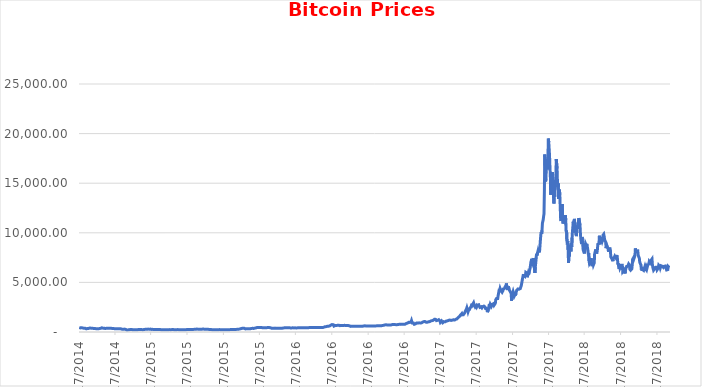
| Category | Series 0 |
|---|---|
| 9/17/14 | 457.334 |
| 9/18/14 | 424.44 |
| 9/19/14 | 394.796 |
| 9/20/14 | 408.904 |
| 9/21/14 | 398.821 |
| 9/22/14 | 402.152 |
| 9/23/14 | 435.791 |
| 9/24/14 | 423.205 |
| 9/25/14 | 411.574 |
| 9/26/14 | 404.425 |
| 9/27/14 | 399.52 |
| 9/28/14 | 377.181 |
| 9/29/14 | 375.467 |
| 9/30/14 | 386.944 |
| 10/1/14 | 383.615 |
| 10/2/14 | 375.072 |
| 10/3/14 | 359.512 |
| 10/4/14 | 328.866 |
| 10/5/14 | 320.51 |
| 10/6/14 | 330.079 |
| 10/7/14 | 336.187 |
| 10/8/14 | 352.94 |
| 10/9/14 | 365.026 |
| 10/10/14 | 361.562 |
| 10/11/14 | 362.299 |
| 10/12/14 | 378.549 |
| 10/13/14 | 390.414 |
| 10/14/14 | 400.87 |
| 10/15/14 | 394.773 |
| 10/16/14 | 382.556 |
| 10/17/14 | 383.758 |
| 10/18/14 | 391.442 |
| 10/19/14 | 389.546 |
| 10/20/14 | 382.845 |
| 10/21/14 | 386.475 |
| 10/22/14 | 383.158 |
| 10/23/14 | 358.417 |
| 10/24/14 | 358.345 |
| 10/25/14 | 347.271 |
| 10/26/14 | 354.704 |
| 10/27/14 | 352.989 |
| 10/28/14 | 357.618 |
| 10/29/14 | 335.591 |
| 10/30/14 | 345.305 |
| 10/31/14 | 338.321 |
| 11/1/14 | 325.749 |
| 11/2/14 | 325.892 |
| 11/3/14 | 327.554 |
| 11/4/14 | 330.492 |
| 11/5/14 | 339.486 |
| 11/6/14 | 349.29 |
| 11/7/14 | 342.415 |
| 11/8/14 | 345.488 |
| 11/9/14 | 363.264 |
| 11/10/14 | 366.924 |
| 11/11/14 | 367.695 |
| 11/12/14 | 423.561 |
| 11/13/14 | 420.735 |
| 11/14/14 | 397.818 |
| 11/15/14 | 376.133 |
| 11/16/14 | 387.882 |
| 11/17/14 | 387.408 |
| 11/18/14 | 375.198 |
| 11/19/14 | 380.555 |
| 11/20/14 | 357.84 |
| 11/21/14 | 350.848 |
| 11/22/14 | 352.92 |
| 11/23/14 | 367.573 |
| 11/24/14 | 376.901 |
| 11/25/14 | 375.348 |
| 11/26/14 | 368.37 |
| 11/27/14 | 369.67 |
| 11/28/14 | 376.447 |
| 11/29/14 | 375.491 |
| 11/30/14 | 378.047 |
| 12/1/14 | 379.245 |
| 12/2/14 | 381.315 |
| 12/3/14 | 375.01 |
| 12/4/14 | 369.604 |
| 12/5/14 | 376.854 |
| 12/6/14 | 374.785 |
| 12/7/14 | 375.095 |
| 12/8/14 | 361.909 |
| 12/9/14 | 352.219 |
| 12/10/14 | 346.365 |
| 12/11/14 | 350.506 |
| 12/12/14 | 352.542 |
| 12/13/14 | 347.376 |
| 12/14/14 | 351.632 |
| 12/15/14 | 345.345 |
| 12/16/14 | 327.062 |
| 12/17/14 | 319.776 |
| 12/18/14 | 311.396 |
| 12/19/14 | 317.843 |
| 12/20/14 | 329.956 |
| 12/21/14 | 320.843 |
| 12/22/14 | 331.886 |
| 12/23/14 | 334.572 |
| 12/24/14 | 322.534 |
| 12/25/14 | 319.008 |
| 12/26/14 | 327.924 |
| 12/27/14 | 315.863 |
| 12/28/14 | 317.239 |
| 12/29/14 | 312.67 |
| 12/30/14 | 310.737 |
| 12/31/14 | 320.193 |
| 1/1/15 | 314.249 |
| 1/2/15 | 315.032 |
| 1/3/15 | 281.082 |
| 1/4/15 | 264.195 |
| 1/5/15 | 274.474 |
| 1/6/15 | 286.189 |
| 1/7/15 | 294.337 |
| 1/8/15 | 283.349 |
| 1/9/15 | 290.408 |
| 1/10/15 | 274.796 |
| 1/11/15 | 265.66 |
| 1/12/15 | 267.796 |
| 1/13/15 | 225.861 |
| 1/14/15 | 178.103 |
| 1/15/15 | 209.844 |
| 1/16/15 | 208.097 |
| 1/17/15 | 199.26 |
| 1/18/15 | 210.339 |
| 1/19/15 | 214.861 |
| 1/20/15 | 211.315 |
| 1/21/15 | 226.897 |
| 1/22/15 | 233.406 |
| 1/23/15 | 232.879 |
| 1/24/15 | 247.847 |
| 1/25/15 | 253.718 |
| 1/26/15 | 273.473 |
| 1/27/15 | 263.475 |
| 1/28/15 | 233.915 |
| 1/29/15 | 233.513 |
| 1/30/15 | 226.425 |
| 1/31/15 | 217.464 |
| 2/1/15 | 226.972 |
| 2/2/15 | 238.229 |
| 2/3/15 | 227.268 |
| 2/4/15 | 226.853 |
| 2/5/15 | 217.111 |
| 2/6/15 | 222.266 |
| 2/7/15 | 227.754 |
| 2/8/15 | 223.412 |
| 2/9/15 | 220.11 |
| 2/10/15 | 219.839 |
| 2/11/15 | 219.185 |
| 2/12/15 | 221.764 |
| 2/13/15 | 235.427 |
| 2/14/15 | 257.321 |
| 2/15/15 | 234.825 |
| 2/16/15 | 233.843 |
| 2/17/15 | 243.61 |
| 2/18/15 | 236.326 |
| 2/19/15 | 240.283 |
| 2/20/15 | 243.779 |
| 2/21/15 | 244.534 |
| 2/22/15 | 235.977 |
| 2/23/15 | 238.892 |
| 2/24/15 | 238.735 |
| 2/25/15 | 237.47 |
| 2/26/15 | 236.426 |
| 2/27/15 | 253.828 |
| 2/28/15 | 254.263 |
| 3/1/15 | 260.202 |
| 3/2/15 | 275.67 |
| 3/3/15 | 281.702 |
| 3/4/15 | 273.092 |
| 3/5/15 | 276.178 |
| 3/6/15 | 272.723 |
| 3/7/15 | 276.261 |
| 3/8/15 | 274.354 |
| 3/9/15 | 289.607 |
| 3/10/15 | 291.76 |
| 3/11/15 | 296.379 |
| 3/12/15 | 294.354 |
| 3/13/15 | 285.337 |
| 3/14/15 | 281.885 |
| 3/15/15 | 286.393 |
| 3/16/15 | 290.593 |
| 3/17/15 | 285.505 |
| 3/18/15 | 256.299 |
| 3/19/15 | 260.928 |
| 3/20/15 | 261.749 |
| 3/21/15 | 260.025 |
| 3/22/15 | 267.96 |
| 3/23/15 | 266.74 |
| 3/24/15 | 245.595 |
| 3/25/15 | 246.197 |
| 3/26/15 | 248.532 |
| 3/27/15 | 247.029 |
| 3/28/15 | 252.798 |
| 3/29/15 | 242.713 |
| 3/30/15 | 247.526 |
| 3/31/15 | 244.224 |
| 4/1/15 | 247.272 |
| 4/2/15 | 253.005 |
| 4/3/15 | 254.322 |
| 4/4/15 | 253.697 |
| 4/5/15 | 260.598 |
| 4/6/15 | 255.492 |
| 4/7/15 | 253.18 |
| 4/8/15 | 245.022 |
| 4/9/15 | 243.676 |
| 4/10/15 | 236.072 |
| 4/11/15 | 236.552 |
| 4/12/15 | 236.153 |
| 4/13/15 | 224.587 |
| 4/14/15 | 219.159 |
| 4/15/15 | 223.833 |
| 4/16/15 | 228.573 |
| 4/17/15 | 222.882 |
| 4/18/15 | 223.356 |
| 4/19/15 | 222.6 |
| 4/20/15 | 224.626 |
| 4/21/15 | 235.269 |
| 4/22/15 | 234.176 |
| 4/23/15 | 236.462 |
| 4/24/15 | 231.268 |
| 4/25/15 | 226.39 |
| 4/26/15 | 219.43 |
| 4/27/15 | 229.286 |
| 4/28/15 | 225.855 |
| 4/29/15 | 225.808 |
| 4/30/15 | 236.145 |
| 5/1/15 | 232.079 |
| 5/2/15 | 234.93 |
| 5/3/15 | 240.358 |
| 5/4/15 | 239.018 |
| 5/5/15 | 236.121 |
| 5/6/15 | 229.782 |
| 5/7/15 | 237.334 |
| 5/8/15 | 243.863 |
| 5/9/15 | 241.832 |
| 5/10/15 | 240.296 |
| 5/11/15 | 242.158 |
| 5/12/15 | 241.112 |
| 5/13/15 | 236.377 |
| 5/14/15 | 236.929 |
| 5/15/15 | 237.605 |
| 5/16/15 | 236.153 |
| 5/17/15 | 236.802 |
| 5/18/15 | 233.128 |
| 5/19/15 | 231.947 |
| 5/20/15 | 234.018 |
| 5/21/15 | 235.344 |
| 5/22/15 | 240.348 |
| 5/23/15 | 238.872 |
| 5/24/15 | 240.953 |
| 5/25/15 | 237.11 |
| 5/26/15 | 237.116 |
| 5/27/15 | 237.283 |
| 5/28/15 | 237.408 |
| 5/29/15 | 237.096 |
| 5/30/15 | 233.345 |
| 5/31/15 | 230.19 |
| 6/1/15 | 222.926 |
| 6/2/15 | 225.803 |
| 6/3/15 | 225.874 |
| 6/4/15 | 224.324 |
| 6/5/15 | 224.952 |
| 6/6/15 | 225.619 |
| 6/7/15 | 222.881 |
| 6/8/15 | 228.489 |
| 6/9/15 | 229.048 |
| 6/10/15 | 228.803 |
| 6/11/15 | 229.705 |
| 6/12/15 | 229.982 |
| 6/13/15 | 232.402 |
| 6/14/15 | 233.543 |
| 6/15/15 | 236.823 |
| 6/16/15 | 250.895 |
| 6/17/15 | 249.284 |
| 6/18/15 | 249.007 |
| 6/19/15 | 244.606 |
| 6/20/15 | 245.212 |
| 6/21/15 | 243.944 |
| 6/22/15 | 246.99 |
| 6/23/15 | 244.296 |
| 6/24/15 | 240.515 |
| 6/25/15 | 242.799 |
| 6/26/15 | 243.594 |
| 6/27/15 | 250.99 |
| 6/28/15 | 249.011 |
| 6/29/15 | 257.064 |
| 6/30/15 | 263.072 |
| 7/1/15 | 258.621 |
| 7/2/15 | 255.412 |
| 7/3/15 | 256.336 |
| 7/4/15 | 260.886 |
| 7/5/15 | 271.913 |
| 7/6/15 | 269.03 |
| 7/7/15 | 266.207 |
| 7/8/15 | 270.785 |
| 7/9/15 | 269.228 |
| 7/10/15 | 284.894 |
| 7/11/15 | 293.115 |
| 7/12/15 | 310.867 |
| 7/13/15 | 292.054 |
| 7/14/15 | 287.464 |
| 7/15/15 | 285.829 |
| 7/16/15 | 278.089 |
| 7/17/15 | 279.472 |
| 7/18/15 | 274.901 |
| 7/19/15 | 273.614 |
| 7/20/15 | 278.981 |
| 7/21/15 | 275.833 |
| 7/22/15 | 277.222 |
| 7/23/15 | 276.049 |
| 7/24/15 | 288.278 |
| 7/25/15 | 288.697 |
| 7/26/15 | 292.686 |
| 7/27/15 | 293.624 |
| 7/28/15 | 294.427 |
| 7/29/15 | 289.59 |
| 7/30/15 | 287.722 |
| 7/31/15 | 284.65 |
| 8/1/15 | 281.601 |
| 8/2/15 | 282.614 |
| 8/3/15 | 281.227 |
| 8/4/15 | 285.218 |
| 8/5/15 | 281.882 |
| 8/6/15 | 278.577 |
| 8/7/15 | 279.585 |
| 8/8/15 | 260.997 |
| 8/9/15 | 265.083 |
| 8/10/15 | 264.47 |
| 8/11/15 | 270.386 |
| 8/12/15 | 266.376 |
| 8/13/15 | 264.08 |
| 8/14/15 | 265.68 |
| 8/15/15 | 261.551 |
| 8/16/15 | 258.507 |
| 8/17/15 | 257.976 |
| 8/18/15 | 211.079 |
| 8/19/15 | 226.684 |
| 8/20/15 | 235.35 |
| 8/21/15 | 232.569 |
| 8/22/15 | 230.39 |
| 8/23/15 | 228.169 |
| 8/24/15 | 210.495 |
| 8/25/15 | 221.609 |
| 8/26/15 | 225.831 |
| 8/27/15 | 224.769 |
| 8/28/15 | 231.396 |
| 8/29/15 | 229.78 |
| 8/30/15 | 228.761 |
| 8/31/15 | 230.056 |
| 9/1/15 | 228.121 |
| 9/2/15 | 229.284 |
| 9/3/15 | 227.183 |
| 9/4/15 | 230.298 |
| 9/5/15 | 235.019 |
| 9/6/15 | 239.84 |
| 9/7/15 | 239.847 |
| 9/8/15 | 243.607 |
| 9/9/15 | 238.168 |
| 9/10/15 | 238.477 |
| 9/11/15 | 240.107 |
| 9/12/15 | 235.229 |
| 9/13/15 | 230.512 |
| 9/14/15 | 230.644 |
| 9/15/15 | 230.304 |
| 9/16/15 | 229.091 |
| 9/17/15 | 229.81 |
| 9/18/15 | 232.975 |
| 9/19/15 | 231.493 |
| 9/20/15 | 231.212 |
| 9/21/15 | 227.085 |
| 9/22/15 | 230.618 |
| 9/23/15 | 230.283 |
| 9/24/15 | 234.529 |
| 9/25/15 | 235.144 |
| 9/26/15 | 234.34 |
| 9/27/15 | 232.757 |
| 9/28/15 | 239.142 |
| 9/29/15 | 236.687 |
| 9/30/15 | 236.06 |
| 10/1/15 | 237.549 |
| 10/2/15 | 237.293 |
| 10/3/15 | 238.73 |
| 10/4/15 | 238.259 |
| 10/5/15 | 240.383 |
| 10/6/15 | 246.063 |
| 10/7/15 | 242.969 |
| 10/8/15 | 242.304 |
| 10/9/15 | 243.931 |
| 10/10/15 | 244.941 |
| 10/11/15 | 247.05 |
| 10/12/15 | 245.308 |
| 10/13/15 | 249.508 |
| 10/14/15 | 251.989 |
| 10/15/15 | 254.32 |
| 10/16/15 | 262.869 |
| 10/17/15 | 270.64 |
| 10/18/15 | 261.643 |
| 10/19/15 | 263.437 |
| 10/20/15 | 269.463 |
| 10/21/15 | 266.272 |
| 10/22/15 | 274.023 |
| 10/23/15 | 276.496 |
| 10/24/15 | 281.654 |
| 10/25/15 | 283.68 |
| 10/26/15 | 285.3 |
| 10/27/15 | 293.788 |
| 10/28/15 | 304.618 |
| 10/29/15 | 313.855 |
| 10/30/15 | 328.015 |
| 10/31/15 | 314.166 |
| 11/1/15 | 325.431 |
| 11/2/15 | 361.189 |
| 11/3/15 | 403.417 |
| 11/4/15 | 411.563 |
| 11/5/15 | 386.354 |
| 11/6/15 | 374.47 |
| 11/7/15 | 386.482 |
| 11/8/15 | 373.368 |
| 11/9/15 | 380.257 |
| 11/10/15 | 336.819 |
| 11/11/15 | 311.084 |
| 11/12/15 | 338.152 |
| 11/13/15 | 336.753 |
| 11/14/15 | 332.906 |
| 11/15/15 | 320.166 |
| 11/16/15 | 330.751 |
| 11/17/15 | 335.094 |
| 11/18/15 | 334.59 |
| 11/19/15 | 326.149 |
| 11/20/15 | 322.022 |
| 11/21/15 | 326.927 |
| 11/22/15 | 324.536 |
| 11/23/15 | 323.046 |
| 11/24/15 | 320.046 |
| 11/25/15 | 328.206 |
| 11/26/15 | 352.684 |
| 11/27/15 | 358.042 |
| 11/28/15 | 357.381 |
| 11/29/15 | 371.294 |
| 11/30/15 | 377.321 |
| 12/1/15 | 362.488 |
| 12/2/15 | 359.187 |
| 12/3/15 | 361.046 |
| 12/4/15 | 363.183 |
| 12/5/15 | 388.949 |
| 12/6/15 | 388.783 |
| 12/7/15 | 395.536 |
| 12/8/15 | 415.563 |
| 12/9/15 | 417.563 |
| 12/10/15 | 415.479 |
| 12/11/15 | 451.938 |
| 12/12/15 | 434.997 |
| 12/13/15 | 433.755 |
| 12/14/15 | 444.182 |
| 12/15/15 | 465.321 |
| 12/16/15 | 454.934 |
| 12/17/15 | 456.078 |
| 12/18/15 | 463.616 |
| 12/19/15 | 462.322 |
| 12/20/15 | 442.685 |
| 12/21/15 | 438.639 |
| 12/22/15 | 436.572 |
| 12/23/15 | 442.401 |
| 12/24/15 | 454.985 |
| 12/25/15 | 455.653 |
| 12/26/15 | 417.274 |
| 12/27/15 | 422.823 |
| 12/28/15 | 422.279 |
| 12/29/15 | 432.983 |
| 12/30/15 | 426.62 |
| 12/31/15 | 430.567 |
| 1/1/16 | 434.334 |
| 1/2/16 | 433.438 |
| 1/3/16 | 430.011 |
| 1/4/16 | 433.091 |
| 1/5/16 | 431.96 |
| 1/6/16 | 429.105 |
| 1/7/16 | 458.048 |
| 1/8/16 | 453.23 |
| 1/9/16 | 447.611 |
| 1/10/16 | 447.991 |
| 1/11/16 | 448.428 |
| 1/12/16 | 435.69 |
| 1/13/16 | 432.371 |
| 1/14/16 | 430.306 |
| 1/15/16 | 364.331 |
| 1/16/16 | 387.536 |
| 1/17/16 | 382.299 |
| 1/18/16 | 387.168 |
| 1/19/16 | 380.149 |
| 1/20/16 | 420.23 |
| 1/21/16 | 410.262 |
| 1/22/16 | 382.492 |
| 1/23/16 | 387.491 |
| 1/24/16 | 402.971 |
| 1/25/16 | 391.726 |
| 1/26/16 | 392.153 |
| 1/27/16 | 394.972 |
| 1/28/16 | 380.289 |
| 1/29/16 | 379.474 |
| 1/30/16 | 378.255 |
| 1/31/16 | 368.767 |
| 2/1/16 | 373.056 |
| 2/2/16 | 374.448 |
| 2/3/16 | 369.949 |
| 2/4/16 | 389.594 |
| 2/5/16 | 386.549 |
| 2/6/16 | 376.522 |
| 2/7/16 | 376.62 |
| 2/8/16 | 373.447 |
| 2/9/16 | 376.029 |
| 2/10/16 | 381.649 |
| 2/11/16 | 379.654 |
| 2/12/16 | 384.263 |
| 2/13/16 | 391.86 |
| 2/14/16 | 407.23 |
| 2/15/16 | 400.185 |
| 2/16/16 | 407.488 |
| 2/17/16 | 416.322 |
| 2/18/16 | 422.373 |
| 2/19/16 | 420.785 |
| 2/20/16 | 437.164 |
| 2/21/16 | 438.798 |
| 2/22/16 | 437.748 |
| 2/23/16 | 420.736 |
| 2/24/16 | 424.955 |
| 2/25/16 | 424.544 |
| 2/26/16 | 432.152 |
| 2/27/16 | 432.519 |
| 2/28/16 | 433.504 |
| 2/29/16 | 437.697 |
| 3/1/16 | 435.123 |
| 3/2/16 | 423.989 |
| 3/3/16 | 421.651 |
| 3/4/16 | 410.939 |
| 3/5/16 | 400.57 |
| 3/6/16 | 407.707 |
| 3/7/16 | 414.321 |
| 3/8/16 | 413.972 |
| 3/9/16 | 414.86 |
| 3/10/16 | 417.131 |
| 3/11/16 | 421.69 |
| 3/12/16 | 411.624 |
| 3/13/16 | 414.065 |
| 3/14/16 | 416.438 |
| 3/15/16 | 416.83 |
| 3/16/16 | 417.011 |
| 3/17/16 | 420.621 |
| 3/18/16 | 409.548 |
| 3/19/16 | 410.444 |
| 3/20/16 | 413.755 |
| 3/21/16 | 413.307 |
| 3/22/16 | 418.089 |
| 3/23/16 | 418.041 |
| 3/24/16 | 416.394 |
| 3/25/16 | 417.177 |
| 3/26/16 | 417.945 |
| 3/27/16 | 426.765 |
| 3/28/16 | 424.231 |
| 3/29/16 | 416.516 |
| 3/30/16 | 414.816 |
| 3/31/16 | 416.729 |
| 4/1/16 | 417.96 |
| 4/2/16 | 420.873 |
| 4/3/16 | 420.904 |
| 4/4/16 | 421.444 |
| 4/5/16 | 424.03 |
| 4/6/16 | 423.413 |
| 4/7/16 | 422.745 |
| 4/8/16 | 420.349 |
| 4/9/16 | 419.411 |
| 4/10/16 | 421.564 |
| 4/11/16 | 422.483 |
| 4/12/16 | 425.19 |
| 4/13/16 | 423.734 |
| 4/14/16 | 424.282 |
| 4/15/16 | 429.713 |
| 4/16/16 | 430.572 |
| 4/17/16 | 427.399 |
| 4/18/16 | 428.591 |
| 4/19/16 | 435.509 |
| 4/20/16 | 441.389 |
| 4/21/16 | 449.425 |
| 4/22/16 | 445.737 |
| 4/23/16 | 450.282 |
| 4/24/16 | 458.555 |
| 4/25/16 | 461.426 |
| 4/26/16 | 466.089 |
| 4/27/16 | 444.687 |
| 4/28/16 | 449.011 |
| 4/29/16 | 455.097 |
| 4/30/16 | 448.318 |
| 5/1/16 | 451.875 |
| 5/2/16 | 444.669 |
| 5/3/16 | 450.304 |
| 5/4/16 | 446.722 |
| 5/5/16 | 447.976 |
| 5/6/16 | 459.603 |
| 5/7/16 | 458.536 |
| 5/8/16 | 458.548 |
| 5/9/16 | 460.483 |
| 5/10/16 | 450.895 |
| 5/11/16 | 452.728 |
| 5/12/16 | 454.766 |
| 5/13/16 | 455.67 |
| 5/14/16 | 455.671 |
| 5/15/16 | 457.568 |
| 5/16/16 | 454.163 |
| 5/17/16 | 453.783 |
| 5/18/16 | 454.619 |
| 5/19/16 | 438.715 |
| 5/20/16 | 442.676 |
| 5/21/16 | 443.188 |
| 5/22/16 | 439.323 |
| 5/23/16 | 444.155 |
| 5/24/16 | 445.981 |
| 5/25/16 | 449.599 |
| 5/26/16 | 453.384 |
| 5/27/16 | 473.464 |
| 5/28/16 | 530.04 |
| 5/29/16 | 526.233 |
| 5/30/16 | 533.864 |
| 5/31/16 | 531.386 |
| 6/1/16 | 536.92 |
| 6/2/16 | 537.972 |
| 6/3/16 | 569.194 |
| 6/4/16 | 572.727 |
| 6/5/16 | 574.977 |
| 6/6/16 | 585.537 |
| 6/7/16 | 576.597 |
| 6/8/16 | 581.645 |
| 6/9/16 | 574.63 |
| 6/10/16 | 577.47 |
| 6/11/16 | 606.727 |
| 6/12/16 | 672.784 |
| 6/13/16 | 704.376 |
| 6/14/16 | 685.559 |
| 6/15/16 | 694.469 |
| 6/16/16 | 766.308 |
| 6/17/16 | 748.909 |
| 6/18/16 | 756.227 |
| 6/19/16 | 763.781 |
| 6/20/16 | 737.226 |
| 6/21/16 | 666.652 |
| 6/22/16 | 596.116 |
| 6/23/16 | 623.977 |
| 6/24/16 | 665.299 |
| 6/25/16 | 665.123 |
| 6/26/16 | 629.367 |
| 6/27/16 | 655.275 |
| 6/28/16 | 647.001 |
| 6/29/16 | 639.89 |
| 6/30/16 | 673.337 |
| 7/1/16 | 676.296 |
| 7/2/16 | 703.702 |
| 7/3/16 | 658.664 |
| 7/4/16 | 683.662 |
| 7/5/16 | 670.627 |
| 7/6/16 | 677.331 |
| 7/7/16 | 640.562 |
| 7/8/16 | 666.523 |
| 7/9/16 | 650.96 |
| 7/10/16 | 649.36 |
| 7/11/16 | 647.659 |
| 7/12/16 | 664.551 |
| 7/13/16 | 654.468 |
| 7/14/16 | 658.078 |
| 7/15/16 | 663.255 |
| 7/16/16 | 660.767 |
| 7/17/16 | 679.459 |
| 7/18/16 | 673.106 |
| 7/19/16 | 672.864 |
| 7/20/16 | 665.685 |
| 7/21/16 | 665.012 |
| 7/22/16 | 650.619 |
| 7/23/16 | 655.556 |
| 7/24/16 | 661.285 |
| 7/25/16 | 654.097 |
| 7/26/16 | 651.784 |
| 7/27/16 | 654.352 |
| 7/28/16 | 655.035 |
| 7/29/16 | 656.992 |
| 7/30/16 | 655.047 |
| 7/31/16 | 624.681 |
| 8/1/16 | 606.272 |
| 8/2/16 | 547.465 |
| 8/3/16 | 566.355 |
| 8/4/16 | 578.289 |
| 8/5/16 | 575.043 |
| 8/6/16 | 587.778 |
| 8/7/16 | 592.69 |
| 8/8/16 | 591.054 |
| 8/9/16 | 587.801 |
| 8/10/16 | 592.103 |
| 8/11/16 | 589.12 |
| 8/12/16 | 587.559 |
| 8/13/16 | 585.588 |
| 8/14/16 | 570.473 |
| 8/15/16 | 567.24 |
| 8/16/16 | 577.439 |
| 8/17/16 | 573.216 |
| 8/18/16 | 574.318 |
| 8/19/16 | 575.63 |
| 8/20/16 | 581.697 |
| 8/21/16 | 581.308 |
| 8/22/16 | 586.753 |
| 8/23/16 | 583.415 |
| 8/24/16 | 580.182 |
| 8/25/16 | 577.761 |
| 8/26/16 | 579.651 |
| 8/27/16 | 569.947 |
| 8/28/16 | 573.912 |
| 8/29/16 | 574.107 |
| 8/30/16 | 577.503 |
| 8/31/16 | 575.472 |
| 9/1/16 | 572.303 |
| 9/2/16 | 575.537 |
| 9/3/16 | 598.212 |
| 9/4/16 | 608.634 |
| 9/5/16 | 606.59 |
| 9/6/16 | 610.436 |
| 9/7/16 | 614.544 |
| 9/8/16 | 626.316 |
| 9/9/16 | 622.861 |
| 9/10/16 | 623.509 |
| 9/11/16 | 606.719 |
| 9/12/16 | 608.243 |
| 9/13/16 | 609.241 |
| 9/14/16 | 610.684 |
| 9/15/16 | 607.155 |
| 9/16/16 | 606.973 |
| 9/17/16 | 605.984 |
| 9/18/16 | 609.874 |
| 9/19/16 | 609.227 |
| 9/20/16 | 608.312 |
| 9/21/16 | 597.149 |
| 9/22/16 | 596.298 |
| 9/23/16 | 602.842 |
| 9/24/16 | 602.625 |
| 9/25/16 | 600.826 |
| 9/26/16 | 608.043 |
| 9/27/16 | 606.166 |
| 9/28/16 | 604.728 |
| 9/29/16 | 605.693 |
| 9/30/16 | 609.735 |
| 10/1/16 | 613.983 |
| 10/2/16 | 610.892 |
| 10/3/16 | 612.133 |
| 10/4/16 | 610.204 |
| 10/5/16 | 612.511 |
| 10/6/16 | 613.021 |
| 10/7/16 | 617.121 |
| 10/8/16 | 619.108 |
| 10/9/16 | 616.752 |
| 10/10/16 | 618.994 |
| 10/11/16 | 641.072 |
| 10/12/16 | 636.192 |
| 10/13/16 | 636.786 |
| 10/14/16 | 640.378 |
| 10/15/16 | 638.646 |
| 10/16/16 | 641.631 |
| 10/17/16 | 639.193 |
| 10/18/16 | 637.96 |
| 10/19/16 | 630.52 |
| 10/20/16 | 630.857 |
| 10/21/16 | 632.828 |
| 10/22/16 | 657.294 |
| 10/23/16 | 657.071 |
| 10/24/16 | 653.761 |
| 10/25/16 | 657.588 |
| 10/26/16 | 678.304 |
| 10/27/16 | 688.313 |
| 10/28/16 | 689.651 |
| 10/29/16 | 714.479 |
| 10/30/16 | 701.864 |
| 10/31/16 | 700.972 |
| 11/1/16 | 729.793 |
| 11/2/16 | 740.829 |
| 11/3/16 | 688.7 |
| 11/4/16 | 703.235 |
| 11/5/16 | 703.418 |
| 11/6/16 | 711.522 |
| 11/7/16 | 703.131 |
| 11/8/16 | 709.848 |
| 11/9/16 | 723.273 |
| 11/10/16 | 715.534 |
| 11/11/16 | 716.411 |
| 11/12/16 | 705.054 |
| 11/13/16 | 702.031 |
| 11/14/16 | 705.021 |
| 11/15/16 | 711.619 |
| 11/16/16 | 744.198 |
| 11/17/16 | 740.977 |
| 11/18/16 | 751.585 |
| 11/19/16 | 751.616 |
| 11/20/16 | 731.026 |
| 11/21/16 | 739.248 |
| 11/22/16 | 751.347 |
| 11/23/16 | 744.594 |
| 11/24/16 | 740.289 |
| 11/25/16 | 741.649 |
| 11/26/16 | 735.382 |
| 11/27/16 | 732.035 |
| 11/28/16 | 735.813 |
| 11/29/16 | 735.604 |
| 11/30/16 | 745.691 |
| 12/1/16 | 756.774 |
| 12/2/16 | 777.944 |
| 12/3/16 | 771.155 |
| 12/4/16 | 773.872 |
| 12/5/16 | 758.7 |
| 12/6/16 | 764.224 |
| 12/7/16 | 768.132 |
| 12/8/16 | 770.81 |
| 12/9/16 | 772.794 |
| 12/10/16 | 774.65 |
| 12/11/16 | 769.731 |
| 12/12/16 | 780.087 |
| 12/13/16 | 780.556 |
| 12/14/16 | 781.481 |
| 12/15/16 | 778.088 |
| 12/16/16 | 784.907 |
| 12/17/16 | 790.829 |
| 12/18/16 | 790.53 |
| 12/19/16 | 792.714 |
| 12/20/16 | 800.876 |
| 12/21/16 | 834.281 |
| 12/22/16 | 864.54 |
| 12/23/16 | 921.984 |
| 12/24/16 | 898.822 |
| 12/25/16 | 896.183 |
| 12/26/16 | 907.61 |
| 12/27/16 | 933.198 |
| 12/28/16 | 975.921 |
| 12/29/16 | 973.497 |
| 12/30/16 | 961.238 |
| 12/31/16 | 963.743 |
| 1/1/17 | 998.325 |
| 1/2/17 | 1021.75 |
| 1/3/17 | 1043.84 |
| 1/4/17 | 1154.73 |
| 1/5/17 | 1013.38 |
| 1/6/17 | 902.201 |
| 1/7/17 | 908.585 |
| 1/8/17 | 911.199 |
| 1/9/17 | 902.828 |
| 1/10/17 | 907.679 |
| 1/11/17 | 777.757 |
| 1/12/17 | 804.834 |
| 1/13/17 | 823.984 |
| 1/14/17 | 818.412 |
| 1/15/17 | 821.798 |
| 1/16/17 | 831.534 |
| 1/17/17 | 907.938 |
| 1/18/17 | 886.618 |
| 1/19/17 | 899.073 |
| 1/20/17 | 895.026 |
| 1/21/17 | 921.789 |
| 1/22/17 | 924.673 |
| 1/23/17 | 921.012 |
| 1/24/17 | 892.687 |
| 1/25/17 | 901.542 |
| 1/26/17 | 917.586 |
| 1/27/17 | 919.75 |
| 1/28/17 | 921.59 |
| 1/29/17 | 919.496 |
| 1/30/17 | 920.382 |
| 1/31/17 | 970.403 |
| 2/1/17 | 989.023 |
| 2/2/17 | 1011.8 |
| 2/3/17 | 1029.91 |
| 2/4/17 | 1042.9 |
| 2/5/17 | 1027.34 |
| 2/6/17 | 1038.15 |
| 2/7/17 | 1061.35 |
| 2/8/17 | 1063.07 |
| 2/9/17 | 994.383 |
| 2/10/17 | 988.674 |
| 2/11/17 | 1004.45 |
| 2/12/17 | 999.181 |
| 2/13/17 | 990.642 |
| 2/14/17 | 1004.55 |
| 2/15/17 | 1007.48 |
| 2/16/17 | 1027.44 |
| 2/17/17 | 1046.21 |
| 2/18/17 | 1054.42 |
| 2/19/17 | 1047.87 |
| 2/20/17 | 1079.98 |
| 2/21/17 | 1115.3 |
| 2/22/17 | 1117.44 |
| 2/23/17 | 1166.72 |
| 2/24/17 | 1173.68 |
| 2/25/17 | 1143.84 |
| 2/26/17 | 1165.2 |
| 2/27/17 | 1179.97 |
| 2/28/17 | 1179.97 |
| 3/1/17 | 1222.5 |
| 3/2/17 | 1251.01 |
| 3/3/17 | 1274.99 |
| 3/4/17 | 1255.15 |
| 3/5/17 | 1267.12 |
| 3/6/17 | 1272.83 |
| 3/7/17 | 1223.54 |
| 3/8/17 | 1150 |
| 3/9/17 | 1188.49 |
| 3/10/17 | 1116.72 |
| 3/11/17 | 1175.83 |
| 3/12/17 | 1221.38 |
| 3/13/17 | 1231.92 |
| 3/14/17 | 1240 |
| 3/15/17 | 1249.61 |
| 3/16/17 | 1187.81 |
| 3/17/17 | 1100.23 |
| 3/18/17 | 973.818 |
| 3/19/17 | 1036.74 |
| 3/20/17 | 1054.23 |
| 3/21/17 | 1120.54 |
| 3/22/17 | 1049.14 |
| 3/23/17 | 1038.59 |
| 3/24/17 | 937.52 |
| 3/25/17 | 972.779 |
| 3/26/17 | 966.725 |
| 3/27/17 | 1045.77 |
| 3/28/17 | 1047.15 |
| 3/29/17 | 1039.97 |
| 3/30/17 | 1026.43 |
| 3/31/17 | 1071.79 |
| 4/1/17 | 1080.5 |
| 4/2/17 | 1102.17 |
| 4/3/17 | 1143.81 |
| 4/4/17 | 1133.25 |
| 4/5/17 | 1124.78 |
| 4/6/17 | 1182.68 |
| 4/7/17 | 1176.9 |
| 4/8/17 | 1175.95 |
| 4/9/17 | 1187.87 |
| 4/10/17 | 1187.13 |
| 4/11/17 | 1205.01 |
| 4/12/17 | 1200.37 |
| 4/13/17 | 1169.28 |
| 4/14/17 | 1167.54 |
| 4/15/17 | 1172.52 |
| 4/16/17 | 1182.94 |
| 4/17/17 | 1193.91 |
| 4/18/17 | 1211.67 |
| 4/19/17 | 1210.29 |
| 4/20/17 | 1229.08 |
| 4/21/17 | 1222.05 |
| 4/22/17 | 1231.71 |
| 4/23/17 | 1207.21 |
| 4/24/17 | 1250.15 |
| 4/25/17 | 1265.49 |
| 4/26/17 | 1281.08 |
| 4/27/17 | 1317.73 |
| 4/28/17 | 1316.48 |
| 4/29/17 | 1321.79 |
| 4/30/17 | 1347.89 |
| 5/1/17 | 1421.6 |
| 5/2/17 | 1452.82 |
| 5/3/17 | 1490.09 |
| 5/4/17 | 1537.67 |
| 5/5/17 | 1555.45 |
| 5/6/17 | 1578.8 |
| 5/7/17 | 1596.71 |
| 5/8/17 | 1723.35 |
| 5/9/17 | 1755.36 |
| 5/10/17 | 1787.13 |
| 5/11/17 | 1848.57 |
| 5/12/17 | 1724.24 |
| 5/13/17 | 1804.91 |
| 5/14/17 | 1808.91 |
| 5/15/17 | 1738.43 |
| 5/16/17 | 1734.45 |
| 5/17/17 | 1839.09 |
| 5/18/17 | 1888.65 |
| 5/19/17 | 1987.71 |
| 5/20/17 | 2084.73 |
| 5/21/17 | 2041.2 |
| 5/22/17 | 2173.4 |
| 5/23/17 | 2320.42 |
| 5/24/17 | 2443.64 |
| 5/25/17 | 2304.98 |
| 5/26/17 | 2202.42 |
| 5/27/17 | 2038.87 |
| 5/28/17 | 2155.8 |
| 5/29/17 | 2255.61 |
| 5/30/17 | 2175.47 |
| 5/31/17 | 2286.41 |
| 6/1/17 | 2407.88 |
| 6/2/17 | 2488.55 |
| 6/3/17 | 2515.35 |
| 6/4/17 | 2511.81 |
| 6/5/17 | 2686.81 |
| 6/6/17 | 2863.2 |
| 6/7/17 | 2732.16 |
| 6/8/17 | 2805.62 |
| 6/9/17 | 2823.81 |
| 6/10/17 | 2947.71 |
| 6/11/17 | 2958.11 |
| 6/12/17 | 2659.63 |
| 6/13/17 | 2717.02 |
| 6/14/17 | 2506.37 |
| 6/15/17 | 2464.58 |
| 6/16/17 | 2518.56 |
| 6/17/17 | 2655.88 |
| 6/18/17 | 2548.29 |
| 6/19/17 | 2589.6 |
| 6/20/17 | 2721.79 |
| 6/21/17 | 2689.1 |
| 6/22/17 | 2705.41 |
| 6/23/17 | 2744.91 |
| 6/24/17 | 2608.72 |
| 6/25/17 | 2589.41 |
| 6/26/17 | 2478.45 |
| 6/27/17 | 2552.45 |
| 6/28/17 | 2574.79 |
| 6/29/17 | 2539.32 |
| 6/30/17 | 2480.84 |
| 7/1/17 | 2434.55 |
| 7/2/17 | 2506.47 |
| 7/3/17 | 2564.06 |
| 7/4/17 | 2601.64 |
| 7/5/17 | 2601.99 |
| 7/6/17 | 2608.56 |
| 7/7/17 | 2518.66 |
| 7/8/17 | 2571.34 |
| 7/9/17 | 2518.44 |
| 7/10/17 | 2372.56 |
| 7/11/17 | 2337.79 |
| 7/12/17 | 2398.84 |
| 7/13/17 | 2357.9 |
| 7/14/17 | 2233.34 |
| 7/15/17 | 1998.86 |
| 7/16/17 | 1929.82 |
| 7/17/17 | 2228.41 |
| 7/18/17 | 2318.88 |
| 7/19/17 | 2273.43 |
| 7/20/17 | 2817.6 |
| 7/21/17 | 2667.76 |
| 7/22/17 | 2810.12 |
| 7/23/17 | 2730.4 |
| 7/24/17 | 2754.86 |
| 7/25/17 | 2576.48 |
| 7/26/17 | 2529.45 |
| 7/27/17 | 2671.78 |
| 7/28/17 | 2809.01 |
| 7/29/17 | 2726.45 |
| 7/30/17 | 2757.18 |
| 7/31/17 | 2875.34 |
| 8/1/17 | 2718.26 |
| 8/2/17 | 2710.67 |
| 8/3/17 | 2804.73 |
| 8/4/17 | 2895.89 |
| 8/5/17 | 3252.91 |
| 8/6/17 | 3213.94 |
| 8/7/17 | 3378.94 |
| 8/8/17 | 3419.94 |
| 8/9/17 | 3342.47 |
| 8/10/17 | 3381.28 |
| 8/11/17 | 3650.62 |
| 8/12/17 | 3884.71 |
| 8/13/17 | 4073.26 |
| 8/14/17 | 4325.13 |
| 8/15/17 | 4181.93 |
| 8/16/17 | 4376.63 |
| 8/17/17 | 4331.69 |
| 8/18/17 | 4160.62 |
| 8/19/17 | 4193.7 |
| 8/20/17 | 4087.66 |
| 8/21/17 | 4001.74 |
| 8/22/17 | 4100.52 |
| 8/23/17 | 4151.52 |
| 8/24/17 | 4334.68 |
| 8/25/17 | 4371.6 |
| 8/26/17 | 4352.4 |
| 8/27/17 | 4382.88 |
| 8/28/17 | 4382.66 |
| 8/29/17 | 4579.02 |
| 8/30/17 | 4565.3 |
| 8/31/17 | 4703.39 |
| 9/1/17 | 4892.01 |
| 9/2/17 | 4578.77 |
| 9/3/17 | 4582.96 |
| 9/4/17 | 4236.31 |
| 9/5/17 | 4376.53 |
| 9/6/17 | 4597.12 |
| 9/7/17 | 4599.88 |
| 9/8/17 | 4228.75 |
| 9/9/17 | 4226.06 |
| 9/10/17 | 4122.94 |
| 9/11/17 | 4161.27 |
| 9/12/17 | 4130.81 |
| 9/13/17 | 3882.59 |
| 9/14/17 | 3154.95 |
| 9/15/17 | 3637.52 |
| 9/16/17 | 3625.04 |
| 9/17/17 | 3582.88 |
| 9/18/17 | 4065.2 |
| 9/19/17 | 3924.97 |
| 9/20/17 | 3905.95 |
| 9/21/17 | 3631.04 |
| 9/22/17 | 3630.7 |
| 9/23/17 | 3792.4 |
| 9/24/17 | 3682.84 |
| 9/25/17 | 3926.07 |
| 9/26/17 | 3892.35 |
| 9/27/17 | 4200.67 |
| 9/28/17 | 4174.73 |
| 9/29/17 | 4163.07 |
| 9/30/17 | 4338.71 |
| 10/1/17 | 4403.74 |
| 10/2/17 | 4409.32 |
| 10/3/17 | 4317.48 |
| 10/4/17 | 4229.36 |
| 10/5/17 | 4328.41 |
| 10/6/17 | 4370.81 |
| 10/7/17 | 4426.89 |
| 10/8/17 | 4610.48 |
| 10/9/17 | 4772.02 |
| 10/10/17 | 4781.99 |
| 10/11/17 | 4826.48 |
| 10/12/17 | 5446.91 |
| 10/13/17 | 5647.21 |
| 10/14/17 | 5831.79 |
| 10/15/17 | 5678.19 |
| 10/16/17 | 5725.59 |
| 10/17/17 | 5605.51 |
| 10/18/17 | 5590.69 |
| 10/19/17 | 5708.52 |
| 10/20/17 | 6011.45 |
| 10/21/17 | 6031.6 |
| 10/22/17 | 6008.42 |
| 10/23/17 | 5930.32 |
| 10/24/17 | 5526.64 |
| 10/25/17 | 5750.8 |
| 10/26/17 | 5904.83 |
| 10/27/17 | 5780.9 |
| 10/28/17 | 5753.09 |
| 10/29/17 | 6153.85 |
| 10/30/17 | 6130.53 |
| 10/31/17 | 6468.4 |
| 11/1/17 | 6767.31 |
| 11/2/17 | 7078.5 |
| 11/3/17 | 7207.76 |
| 11/4/17 | 7379.95 |
| 11/5/17 | 7407.41 |
| 11/6/17 | 7022.76 |
| 11/7/17 | 7144.38 |
| 11/8/17 | 7459.69 |
| 11/9/17 | 7143.58 |
| 11/10/17 | 6618.14 |
| 11/11/17 | 6357.6 |
| 11/12/17 | 5950.07 |
| 11/13/17 | 6559.49 |
| 11/14/17 | 6635.75 |
| 11/15/17 | 7315.54 |
| 11/16/17 | 7871.69 |
| 11/17/17 | 7708.99 |
| 11/18/17 | 7790.15 |
| 11/19/17 | 8036.49 |
| 11/20/17 | 8200.64 |
| 11/21/17 | 8071.26 |
| 11/22/17 | 8253.55 |
| 11/23/17 | 8038.77 |
| 11/24/17 | 8253.69 |
| 11/25/17 | 8790.92 |
| 11/26/17 | 9330.55 |
| 11/27/17 | 9818.35 |
| 11/28/17 | 10058.8 |
| 11/29/17 | 9888.61 |
| 11/30/17 | 10233.6 |
| 12/1/17 | 10975.6 |
| 12/2/17 | 11074.6 |
| 12/3/17 | 11323.2 |
| 12/4/17 | 11657.2 |
| 12/5/17 | 11916.7 |
| 12/6/17 | 14291.5 |
| 12/7/17 | 17899.699 |
| 12/8/17 | 16569.4 |
| 12/9/17 | 15178.2 |
| 12/10/17 | 15455.4 |
| 12/11/17 | 16936.801 |
| 12/12/17 | 17415.4 |
| 12/13/17 | 16408.199 |
| 12/14/17 | 16564 |
| 12/15/17 | 17706.9 |
| 12/16/17 | 19497.4 |
| 12/17/17 | 19140.801 |
| 12/18/17 | 19114.199 |
| 12/19/17 | 17776.699 |
| 12/20/17 | 16624.6 |
| 12/21/17 | 15802.9 |
| 12/22/17 | 13831.8 |
| 12/23/17 | 14699.2 |
| 12/24/17 | 13925.8 |
| 12/25/17 | 14026.6 |
| 12/26/17 | 16099.8 |
| 12/27/17 | 15838.5 |
| 12/28/17 | 14606.5 |
| 12/29/17 | 14656.2 |
| 12/30/17 | 12952.2 |
| 12/31/17 | 14156.4 |
| 1/1/18 | 13657.2 |
| 1/2/18 | 14982.1 |
| 1/3/18 | 15201 |
| 1/4/18 | 15599.2 |
| 1/5/18 | 17429.5 |
| 1/6/18 | 17527 |
| 1/7/18 | 16477.6 |
| 1/8/18 | 15170.1 |
| 1/9/18 | 14595.4 |
| 1/10/18 | 14973.3 |
| 1/11/18 | 13405.8 |
| 1/12/18 | 13980.6 |
| 1/13/18 | 14360.2 |
| 1/14/18 | 13772 |
| 1/15/18 | 13819.8 |
| 1/16/18 | 11490.5 |
| 1/17/18 | 11188.6 |
| 1/18/18 | 11474.9 |
| 1/19/18 | 11607.4 |
| 1/20/18 | 12899.2 |
| 1/21/18 | 11600.1 |
| 1/22/18 | 10931.4 |
| 1/23/18 | 10868.4 |
| 1/24/18 | 11359.4 |
| 1/25/18 | 11259.4 |
| 1/26/18 | 11171.4 |
| 1/27/18 | 11440.7 |
| 1/28/18 | 11786.3 |
| 1/29/18 | 11296.4 |
| 1/30/18 | 10106.3 |
| 1/31/18 | 10221.1 |
| 2/1/18 | 9170.54 |
| 2/2/18 | 8830.75 |
| 2/3/18 | 9174.91 |
| 2/4/18 | 8277.01 |
| 2/5/18 | 6955.27 |
| 2/6/18 | 7754 |
| 2/7/18 | 7621.3 |
| 2/8/18 | 8265.59 |
| 2/9/18 | 8736.98 |
| 2/10/18 | 8621.9 |
| 2/11/18 | 8129.97 |
| 2/12/18 | 8926.57 |
| 2/13/18 | 8598.31 |
| 2/14/18 | 9494.63 |
| 2/15/18 | 10166.4 |
| 2/16/18 | 10233.9 |
| 2/17/18 | 11112.7 |
| 2/18/18 | 10551.8 |
| 2/19/18 | 11225.3 |
| 2/20/18 | 11403.7 |
| 2/21/18 | 10690.4 |
| 2/22/18 | 10005 |
| 2/23/18 | 10301.1 |
| 2/24/18 | 9813.07 |
| 2/25/18 | 9664.73 |
| 2/26/18 | 10366.7 |
| 2/27/18 | 10725.6 |
| 2/28/18 | 10397.9 |
| 3/1/18 | 10951 |
| 3/2/18 | 11086.4 |
| 3/3/18 | 11489.7 |
| 3/4/18 | 11512.6 |
| 3/5/18 | 11573.3 |
| 3/6/18 | 10779.9 |
| 3/7/18 | 9965.57 |
| 3/8/18 | 9395.01 |
| 3/9/18 | 9337.55 |
| 3/10/18 | 8866 |
| 3/11/18 | 9578.63 |
| 3/12/18 | 9205.12 |
| 3/13/18 | 9194.85 |
| 3/14/18 | 8269.81 |
| 3/15/18 | 8300.86 |
| 3/16/18 | 8338.35 |
| 3/17/18 | 7916.88 |
| 3/18/18 | 8223.68 |
| 3/19/18 | 8630.65 |
| 3/20/18 | 8913.47 |
| 3/21/18 | 8929.28 |
| 3/22/18 | 8728.47 |
| 3/23/18 | 8879.62 |
| 3/24/18 | 8668.12 |
| 3/25/18 | 8495.78 |
| 3/26/18 | 8209.4 |
| 3/27/18 | 7833.04 |
| 3/28/18 | 7954.48 |
| 3/29/18 | 7165.7 |
| 3/30/18 | 6890.52 |
| 3/31/18 | 6973.53 |
| 4/1/18 | 6844.23 |
| 4/2/18 | 7083.8 |
| 4/3/18 | 7456.11 |
| 4/4/18 | 6853.84 |
| 4/5/18 | 6811.47 |
| 4/6/18 | 6636.32 |
| 4/7/18 | 6911.09 |
| 4/8/18 | 7023.52 |
| 4/9/18 | 6770.73 |
| 4/10/18 | 6834.76 |
| 4/11/18 | 6968.32 |
| 4/12/18 | 7889.25 |
| 4/13/18 | 7895.96 |
| 4/14/18 | 7986.24 |
| 4/15/18 | 8329.11 |
| 4/16/18 | 8058.67 |
| 4/17/18 | 7902.09 |
| 4/18/18 | 8163.42 |
| 4/19/18 | 8294.31 |
| 4/20/18 | 8845.83 |
| 4/21/18 | 8895.58 |
| 4/22/18 | 8802.46 |
| 4/23/18 | 8930.88 |
| 4/24/18 | 9697.5 |
| 4/25/18 | 8845.74 |
| 4/26/18 | 9281.51 |
| 4/27/18 | 8987.05 |
| 4/28/18 | 9348.48 |
| 4/29/18 | 9419.08 |
| 4/30/18 | 9240.55 |
| 5/1/18 | 9119.01 |
| 5/2/18 | 9235.92 |
| 5/3/18 | 9743.86 |
| 5/4/18 | 9700.76 |
| 5/5/18 | 9858.15 |
| 5/6/18 | 9654.8 |
| 5/7/18 | 9373.01 |
| 5/8/18 | 9234.82 |
| 5/9/18 | 9325.18 |
| 5/10/18 | 9043.94 |
| 5/11/18 | 8441.49 |
| 5/12/18 | 8504.89 |
| 5/13/18 | 8723.94 |
| 5/14/18 | 8716.79 |
| 5/15/18 | 8510.38 |
| 5/16/18 | 8368.83 |
| 5/17/18 | 8094.32 |
| 5/18/18 | 8250.97 |
| 5/19/18 | 8247.18 |
| 5/20/18 | 8513.25 |
| 5/21/18 | 8418.99 |
| 5/22/18 | 8041.78 |
| 5/23/18 | 7557.82 |
| 5/24/18 | 7587.34 |
| 5/25/18 | 7480.14 |
| 5/26/18 | 7355.88 |
| 5/27/18 | 7368.22 |
| 5/28/18 | 7135.99 |
| 5/29/18 | 7472.59 |
| 5/30/18 | 7406.52 |
| 5/31/18 | 7494.17 |
| 6/1/18 | 7541.45 |
| 6/2/18 | 7643.45 |
| 6/3/18 | 7720.25 |
| 6/4/18 | 7514.47 |
| 6/5/18 | 7633.76 |
| 6/6/18 | 7653.98 |
| 6/7/18 | 7678.24 |
| 6/8/18 | 7624.92 |
| 6/9/18 | 7531.98 |
| 6/10/18 | 6786.02 |
| 6/11/18 | 6906.92 |
| 6/12/18 | 6582.36 |
| 6/13/18 | 6349.9 |
| 6/14/18 | 6675.35 |
| 6/15/18 | 6456.58 |
| 6/16/18 | 6550.16 |
| 6/17/18 | 6499.27 |
| 6/18/18 | 6734.82 |
| 6/19/18 | 6769.94 |
| 6/20/18 | 6776.55 |
| 6/21/18 | 6729.74 |
| 6/22/18 | 6083.69 |
| 6/23/18 | 6162.48 |
| 6/24/18 | 6173.23 |
| 6/25/18 | 6249.18 |
| 6/26/18 | 6093.67 |
| 6/27/18 | 6157.13 |
| 6/28/18 | 5903.44 |
| 6/29/18 | 6218.3 |
| 6/30/18 | 6404 |
| 7/1/18 | 6385.82 |
| 7/2/18 | 6614.18 |
| 7/3/18 | 6529.59 |
| 7/4/18 | 6597.55 |
| 7/5/18 | 6639.14 |
| 7/6/18 | 6673.5 |
| 7/7/18 | 6856.93 |
| 7/8/18 | 6773.88 |
| 7/9/18 | 6741.75 |
| 7/10/18 | 6329.95 |
| 7/11/18 | 6394.71 |
| 7/12/18 | 6228.81 |
| 7/13/18 | 6238.05 |
| 7/14/18 | 6276.12 |
| 7/15/18 | 6359.64 |
| 7/16/18 | 6741.75 |
| 7/17/18 | 7321.04 |
| 7/18/18 | 7370.78 |
| 7/19/18 | 7466.86 |
| 7/20/18 | 7354.13 |
| 7/21/18 | 7419.29 |
| 7/22/18 | 7418.49 |
| 7/23/18 | 7711.11 |
| 7/24/18 | 8424.27 |
| 7/25/18 | 8181.39 |
| 7/26/18 | 7951.58 |
| 7/27/18 | 8165.01 |
| 7/28/18 | 8192.15 |
| 7/29/18 | 8218.46 |
| 7/30/18 | 8180.48 |
| 7/31/18 | 7780.44 |
| 8/1/18 | 7624.91 |
| 8/2/18 | 7567.15 |
| 8/3/18 | 7434.39 |
| 8/4/18 | 7032.85 |
| 8/5/18 | 7068.48 |
| 8/6/18 | 6951.8 |
| 8/7/18 | 6753.12 |
| 8/8/18 | 6305.8 |
| 8/9/18 | 6568.23 |
| 8/10/18 | 6184.71 |
| 8/11/18 | 6295.73 |
| 8/12/18 | 6322.69 |
| 8/13/18 | 6297.57 |
| 8/14/18 | 6199.71 |
| 8/15/18 | 6308.52 |
| 8/16/18 | 6334.73 |
| 8/17/18 | 6580.63 |
| 8/18/18 | 6423.76 |
| 8/19/18 | 6506.07 |
| 8/20/18 | 6308.53 |
| 8/21/18 | 6488.76 |
| 8/22/18 | 6376.71 |
| 8/23/18 | 6534.88 |
| 8/24/18 | 6719.96 |
| 8/25/18 | 6763.19 |
| 8/26/18 | 6707.26 |
| 8/27/18 | 6884.64 |
| 8/28/18 | 7096.28 |
| 8/29/18 | 7047.16 |
| 8/30/18 | 6978.23 |
| 8/31/18 | 7037.58 |
| 9/1/18 | 7193.25 |
| 9/2/18 | 7272.72 |
| 9/3/18 | 7260.06 |
| 9/4/18 | 7361.66 |
| 9/5/18 | 6792.83 |
| 9/6/18 | 6529.17 |
| 9/7/18 | 6467.07 |
| 9/8/18 | 6225.98 |
| 9/9/18 | 6300.86 |
| 9/10/18 | 6329.7 |
| 9/11/18 | 6321.2 |
| 9/12/18 | 6351.8 |
| 9/13/18 | 6517.31 |
| 9/14/18 | 6512.71 |
| 9/15/18 | 6543.2 |
| 9/16/18 | 6517.18 |
| 9/17/18 | 6281.2 |
| 9/18/18 | 6371.3 |
| 9/19/18 | 6398.54 |
| 9/20/18 | 6519.67 |
| 9/21/18 | 6734.95 |
| 9/22/18 | 6721.98 |
| 9/23/18 | 6710.63 |
| 9/24/18 | 6595.41 |
| 9/25/18 | 6446.47 |
| 9/26/18 | 6495 |
| 9/27/18 | 6676.75 |
| 9/28/18 | 6644.13 |
| 9/29/18 | 6601.96 |
| 9/30/18 | 6625.56 |
| 10/1/18 | 6589.62 |
| 10/2/18 | 6556.1 |
| 10/3/18 | 6502.59 |
| 10/4/18 | 6576.69 |
| 10/5/18 | 6622.48 |
| 10/6/18 | 6588.31 |
| 10/7/18 | 6602.95 |
| 10/8/18 | 6652.23 |
| 10/9/18 | 6642.64 |
| 10/10/18 | 6585.53 |
| 10/11/18 | 6256.24 |
| 10/12/18 | 6274.58 |
| 10/13/18 | 6285.99 |
| 10/14/18 | 6290.93 |
| 10/15/18 | 6596.54 |
| 10/16/18 | 6596.11 |
| 10/17/18 | 6544.43 |
| 10/18/18 | 6476.71 |
| 10/19/18 | 6465.41 |